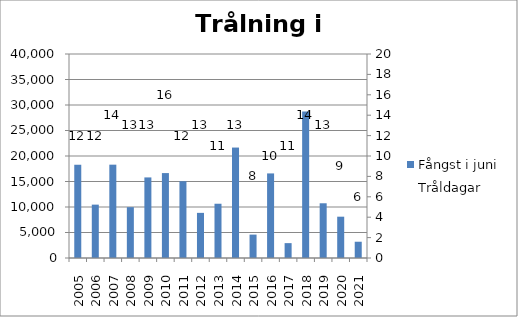
| Category | Fångst i juni |
|---|---|
| 2005.0 | 18285 |
| 2006.0 | 10465 |
| 2007.0 | 18300 |
| 2008.0 | 9970 |
| 2009.0 | 15800 |
| 2010.0 | 16650 |
| 2011.0 | 15050 |
| 2012.0 | 8850 |
| 2013.0 | 10640 |
| 2014.0 | 21656 |
| 2015.0 | 4588 |
| 2016.0 | 16585 |
| 2017.0 | 2916 |
| 2018.0 | 28750 |
| 2019.0 | 10730 |
| 2020.0 | 8100 |
| 2021.0 | 3190 |